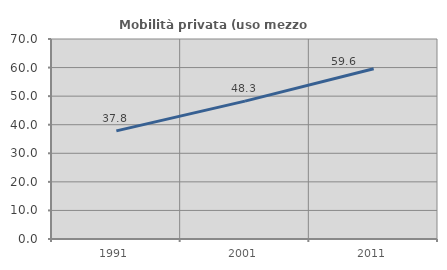
| Category | Mobilità privata (uso mezzo privato) |
|---|---|
| 1991.0 | 37.843 |
| 2001.0 | 48.259 |
| 2011.0 | 59.562 |